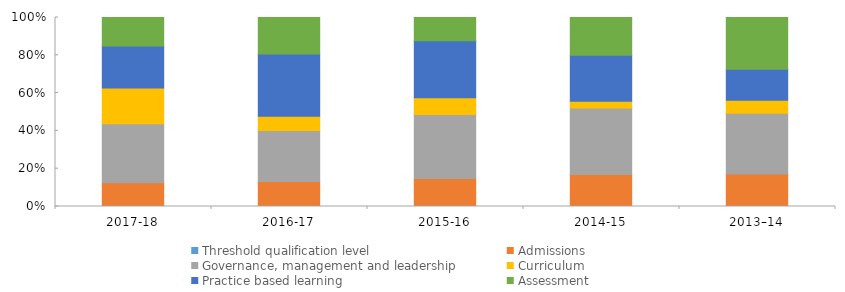
| Category | Threshold qualification level | Admissions | Governance, management and leadership | Curriculum | Practice based learning | Assessment |
|---|---|---|---|---|---|---|
| 2017-18 | 0 | 0.125 | 0.313 | 0.189 | 0.222 | 0.15 |
| 2016-17 | 0 | 0.132 | 0.271 | 0.075 | 0.329 | 0.194 |
| 2015-16 | 0 | 0.149 | 0.338 | 0.089 | 0.302 | 0.123 |
| 2014-15 | 0 | 0.17 | 0.352 | 0.035 | 0.244 | 0.2 |
| 2013–14 | 0 | 0.172 | 0.321 | 0.069 | 0.164 | 0.273 |